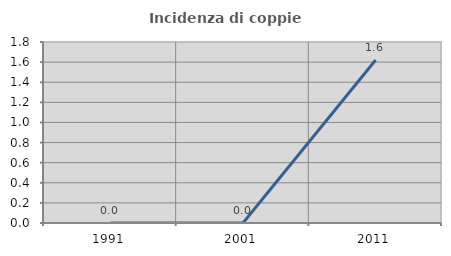
| Category | Incidenza di coppie miste |
|---|---|
| 1991.0 | 0 |
| 2001.0 | 0 |
| 2011.0 | 1.622 |